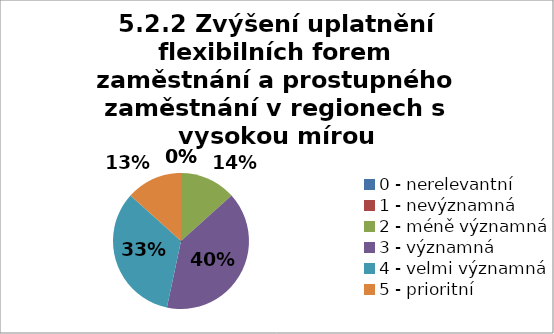
| Category | Series 6 | Series 5 | Series 4 | Series 3 | Series 2 | Series 1 | Series 0 |
|---|---|---|---|---|---|---|---|
| 0 - nerelevantní | 0 | 0 | 6.667 | 0 | 0 | 0 | 0 |
| 1 - nevýznamná | 0 | 0 | 0 | 0 | 6.667 | 0 | 0 |
| 2 - méně významná | 13.333 | 13.333 | 6.667 | 26.667 | 0 | 6.667 | 0 |
| 3 - významná | 40 | 40 | 40 | 46.667 | 53.333 | 46.667 | 33.333 |
| 4 - velmi významná | 33.333 | 20 | 26.667 | 13.333 | 40 | 33.333 | 40 |
| 5 - prioritní | 13.333 | 26.667 | 20 | 13.333 | 0 | 13.333 | 26.667 |